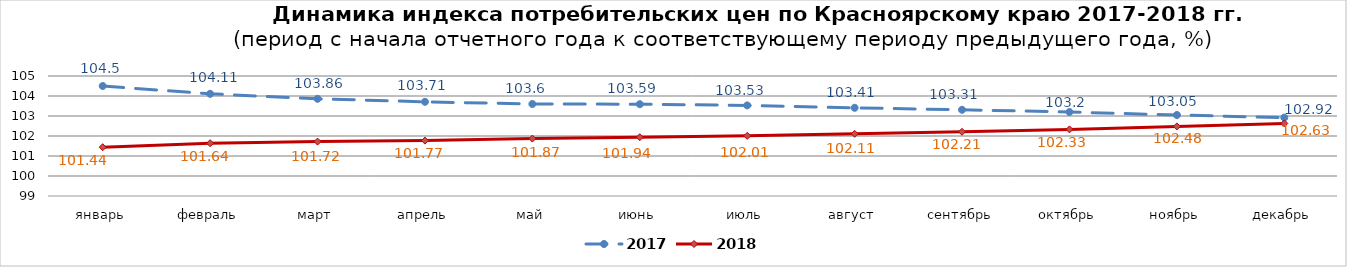
| Category | 2017 | 2018 |
|---|---|---|
| январь | 104.5 | 101.44 |
| февраль | 104.11 | 101.64 |
| март | 103.86 | 101.72 |
| апрель | 103.71 | 101.77 |
| май | 103.6 | 101.87 |
| июнь | 103.59 | 101.94 |
| июль | 103.53 | 102.01 |
| август | 103.41 | 102.11 |
| сентябрь | 103.31 | 102.21 |
| октябрь | 103.2 | 102.33 |
| ноябрь | 103.05 | 102.48 |
| декабрь | 102.92 | 102.63 |